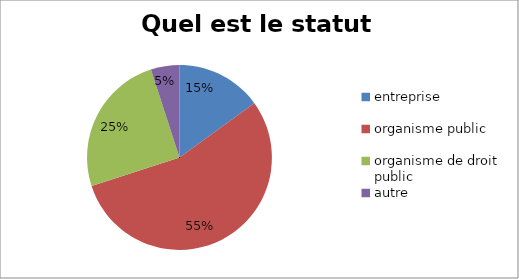
| Category | Quel est le statut juridique? |
|---|---|
| entreprise | 3 |
| organisme public | 11 |
| organisme de droit public | 5 |
| autre | 1 |